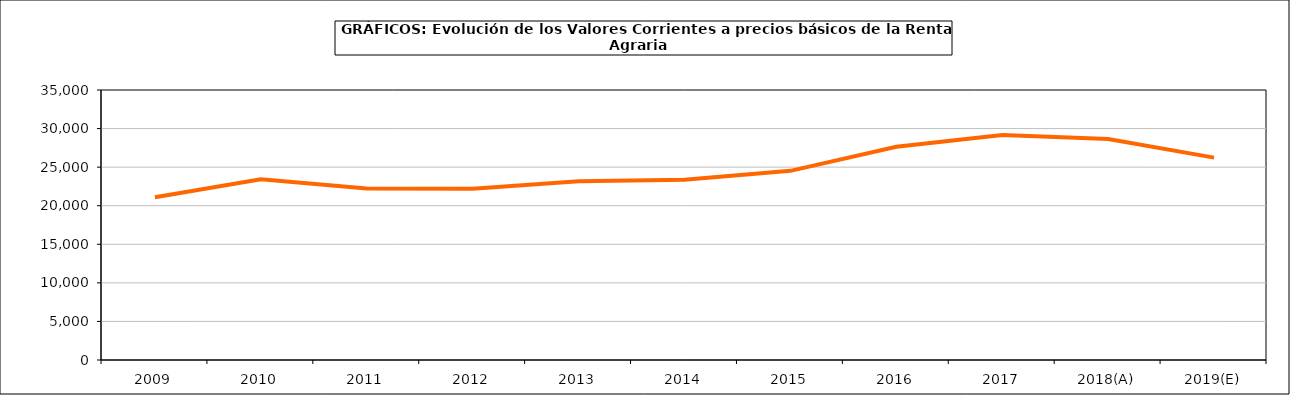
| Category | renta agraria |
|---|---|
| 2009 | 21101 |
| 2010 | 23433.2 |
| 2011 | 22219.2 |
| 2012 | 22193.5 |
| 2013 | 23161.5 |
| 2014 | 23361.1 |
| 2015 | 24518.8 |
| 2016 | 27646.8 |
| 2017 | 29152.2 |
| 2018(A) | 28643.2 |
| 2019(E) | 26234.5 |